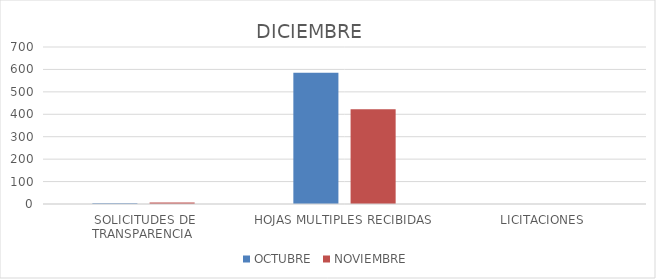
| Category | OCTUBRE | NOVIEMBRE |
|---|---|---|
| SOLICITUDES DE TRANSPARENCIA  | 3 | 7 |
| HOJAS MULTIPLES RECIBIDAS | 585 | 422 |
| LICITACIONES  | 0 | 0 |